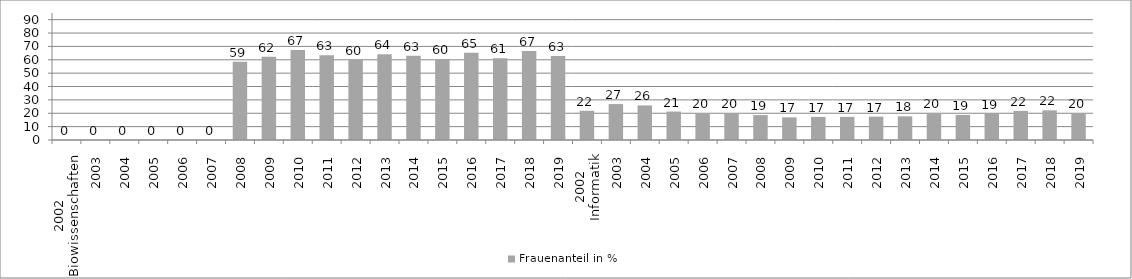
| Category | Frauenanteil in % |
|---|---|
| 0 | 0 |
| 1 | 0 |
| 2 | 0 |
| 3 | 0 |
| 4 | 0 |
| 5 | 0 |
| 6 | 58.621 |
| 7 | 62.353 |
| 8 | 67.407 |
| 9 | 63.333 |
| 10 | 59.864 |
| 11 | 64.234 |
| 12 | 62.963 |
| 13 | 60.432 |
| 14 | 65.269 |
| 15 | 61.184 |
| 16 | 66.667 |
| 17 | 62.838 |
| 18 | 21.875 |
| 19 | 26.86 |
| 20 | 25.85 |
| 21 | 21.281 |
| 22 | 19.895 |
| 23 | 19.94 |
| 24 | 18.619 |
| 25 | 16.949 |
| 26 | 17.275 |
| 27 | 17.309 |
| 28 | 17.46 |
| 29 | 17.685 |
| 30 | 20.246 |
| 31 | 18.755 |
| 32 | 19.484 |
| 33 | 21.789 |
| 34 | 22.183 |
| 35 | 20.198 |